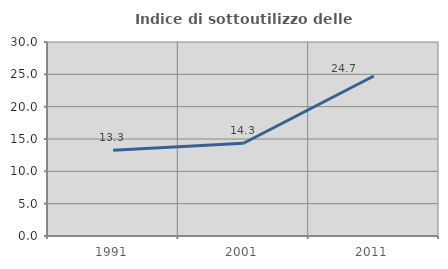
| Category | Indice di sottoutilizzo delle abitazioni  |
|---|---|
| 1991.0 | 13.252 |
| 2001.0 | 14.342 |
| 2011.0 | 24.745 |